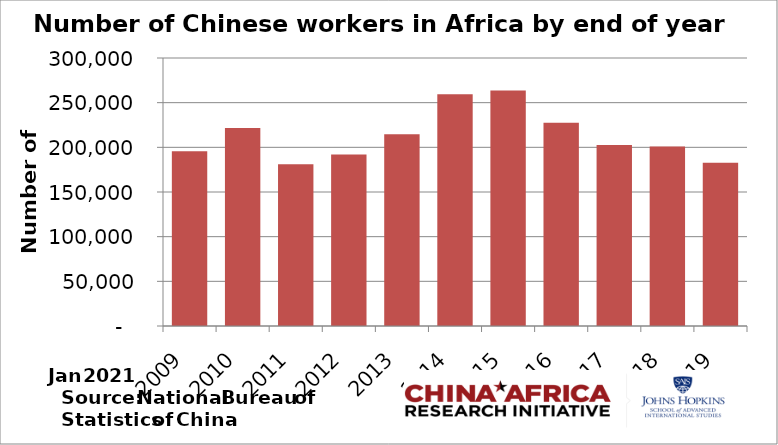
| Category | series 1 |
|---|---|
| 2009.0 | 195716 |
| 2010.0 | 221604 |
| 2011.0 | 181079 |
| 2012.0 | 192011 |
| 2013.0 | 214534 |
| 2014.0 | 259370 |
| 2015.0 | 263659 |
| 2016.0 | 227407 |
| 2017.0 | 202689 |
| 2018.0 | 201058 |
| 2019.0 | 182745 |